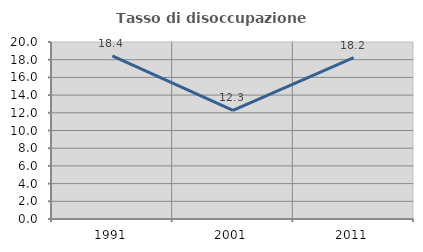
| Category | Tasso di disoccupazione giovanile  |
|---|---|
| 1991.0 | 18.428 |
| 2001.0 | 12.281 |
| 2011.0 | 18.227 |